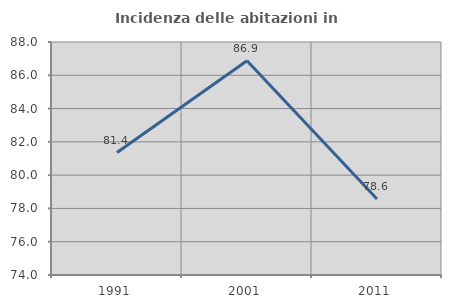
| Category | Incidenza delle abitazioni in proprietà  |
|---|---|
| 1991.0 | 81.356 |
| 2001.0 | 86.869 |
| 2011.0 | 78.571 |